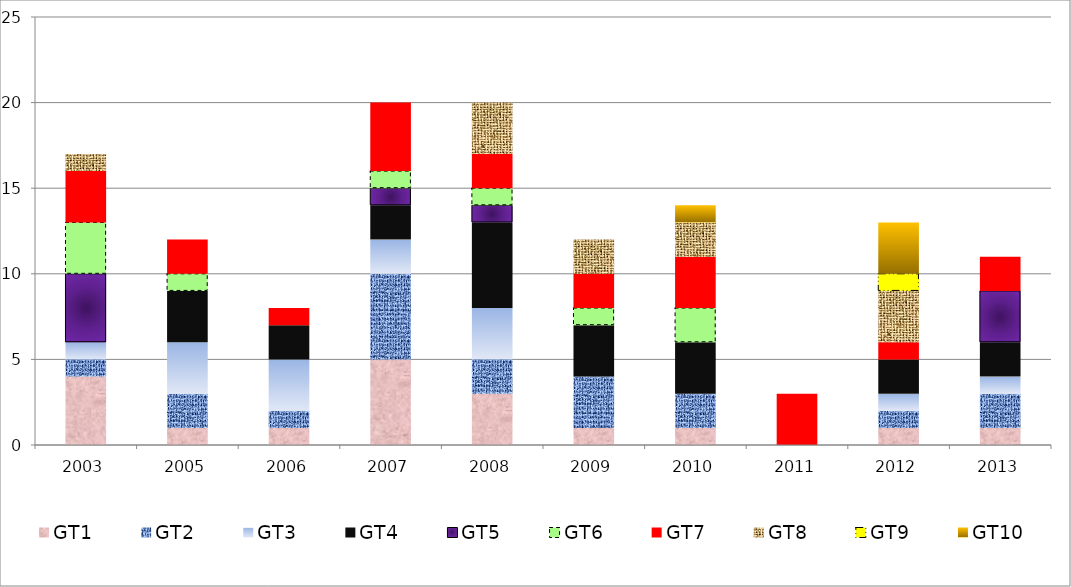
| Category | GT1 | GT2 | GT3 | GT4 | GT5 | GT6 | GT7 | GT8 | GT9 | GT10 |
|---|---|---|---|---|---|---|---|---|---|---|
| 2003.0 | 4 | 1 | 1 | 0 | 4 | 3 | 3 | 1 | 0 | 0 |
| 2005.0 | 1 | 2 | 3 | 3 | 0 | 1 | 2 | 0 | 0 | 0 |
| 2006.0 | 1 | 1 | 3 | 2 | 0 | 0 | 1 | 0 | 0 | 0 |
| 2007.0 | 5 | 5 | 2 | 2 | 1 | 1 | 4 | 0 | 0 | 0 |
| 2008.0 | 3 | 2 | 3 | 5 | 1 | 1 | 2 | 3 | 0 | 0 |
| 2009.0 | 1 | 3 | 0 | 3 | 0 | 1 | 2 | 2 | 0 | 0 |
| 2010.0 | 1 | 2 | 0 | 3 | 0 | 2 | 3 | 2 | 0 | 1 |
| 2011.0 | 0 | 0 | 0 | 0 | 0 | 0 | 3 | 0 | 0 | 0 |
| 2012.0 | 1 | 1 | 1 | 2 | 0 | 0 | 1 | 3 | 1 | 3 |
| 2013.0 | 1 | 2 | 1 | 2 | 3 | 0 | 2 | 0 | 0 | 0 |